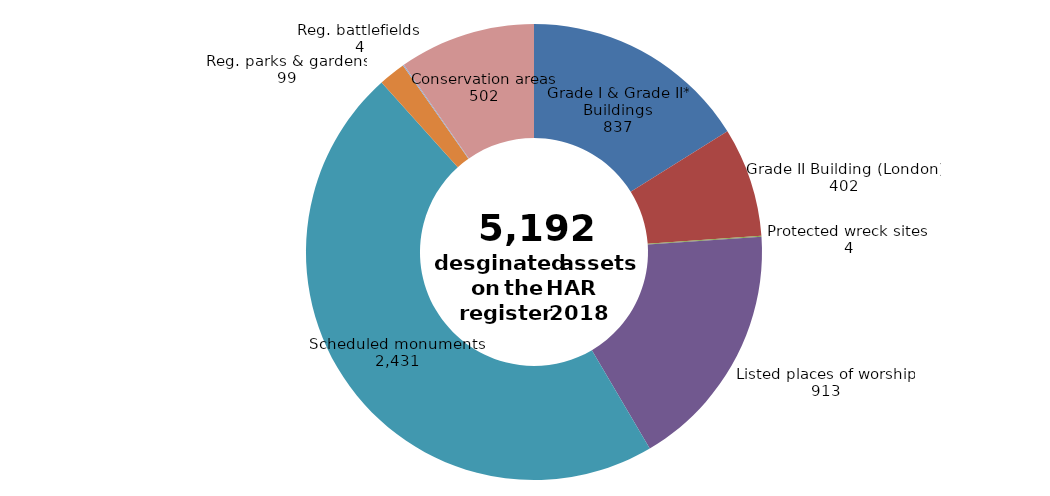
| Category | Number of designated assets on the HAR Register 2018 |
|---|---|
| Grade I & Grade II* Buildings | 837 |
| Grade II Building (London) | 402 |
| Protected wreck sites  | 4 |
| Listed places of worship | 913 |
| Scheduled monuments  | 2431 |
| Reg. parks & gardens | 99 |
| Reg. battlefields  | 4 |
| Conservation areas | 502 |